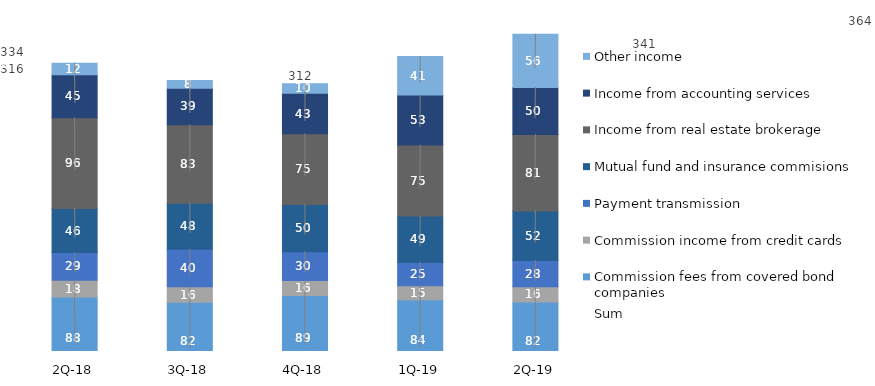
| Category | Commission fees from covered bond companies | Commission income from credit cards | Payment transmission | Mutual fund and insurance commisions | Income from real estate brokerage | Income from accounting services | Other income |
|---|---|---|---|---|---|---|---|
| 2Q-19 | 82.1 | 16.08 | 27.71 | 52.19 | 80.63 | 49.6 | 56.1 |
| 1Q-19 | 84.47 | 14.808 | 24.665 | 48.809 | 74.895 | 52.707 | 40.514 |
| 4Q-18 | 88.946 | 15.972 | 30.264 | 49.714 | 74.631 | 42.743 | 10.109 |
| 3Q-18 | 81.9 | 16.26 | 39.73 | 48.31 | 82.95 | 38.5 | 7.99 |
| 2Q-18 | 87.5 | 17.57 | 29.25 | 46.31 | 95.71 | 45.44 | 12 |